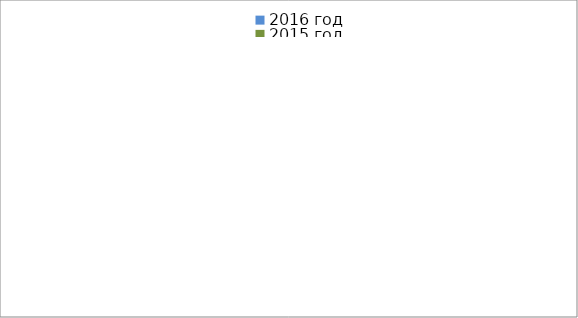
| Category | 2016 год | 2015 год |
|---|---|---|
|  - поджог | 40 | 33 |
|  - неосторожное обращение с огнём | 22 | 52 |
|  - НПТЭ электрооборудования | 17 | 14 |
|  - НПУ и Э печей | 31 | 51 |
|  - НПУ и Э транспортных средств | 31 | 38 |
|   -Шалость с огнем детей | 6 | 3 |
|  -НППБ при эксплуатации эл.приборов | 16 | 12 |
|  - курение | 22 | 22 |
| - прочие | 92 | 84 |
| - не установленные причины | 12 | 14 |